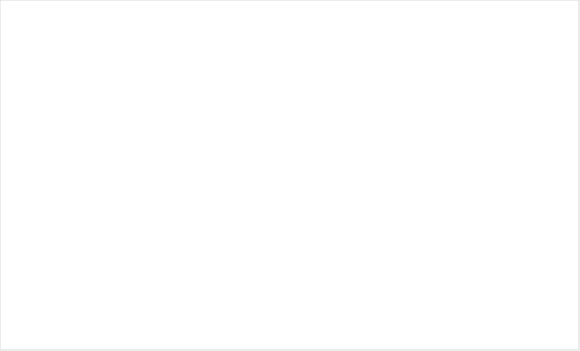
| Category | Итог |
|---|---|
| 5 | 1 |
| 7 | 1 |
| 8 | 1 |
| 9 | 4 |
| 10 | 9 |